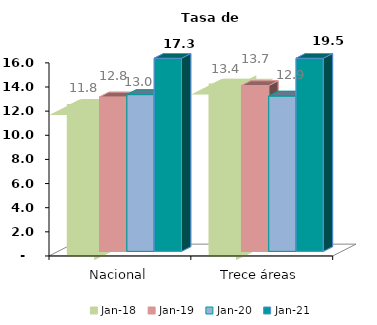
| Category | ene-18 | ene-19 | ene-20 | ene-21 |
|---|---|---|---|---|
| Nacional | 11.762 | 12.795 | 12.988 | 17.267 |
| Trece áreas | 13.446 | 13.739 | 12.868 | 19.457 |